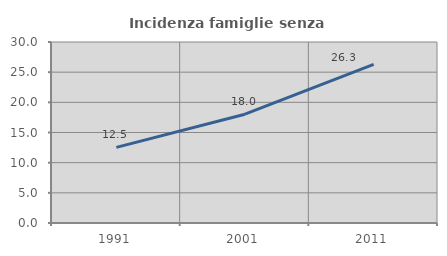
| Category | Incidenza famiglie senza nuclei |
|---|---|
| 1991.0 | 12.534 |
| 2001.0 | 18.031 |
| 2011.0 | 26.285 |